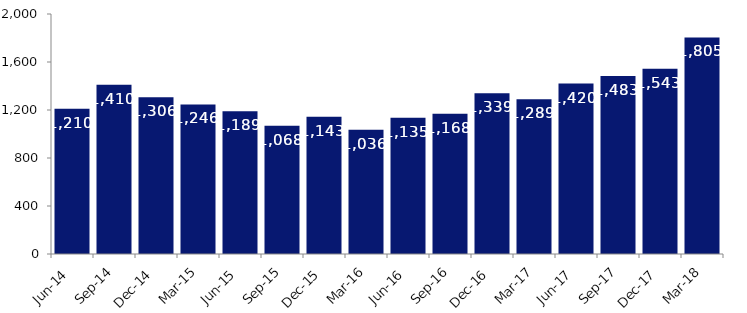
| Category | Series 0 |
|---|---|
| Jun-14 | 1210 |
| Sep-14 | 1410 |
| Dec-14 | 1306 |
| Mar-15 | 1246 |
| Jun-15 | 1189 |
| Sep-15 | 1068 |
| Dec-15 | 1143 |
| Mar-16 | 1036 |
| Jun-16 | 1135 |
| Sep-16 | 1168 |
| Dec-16 | 1339 |
| Mar-17 | 1289 |
| Jun-17 | 1420 |
| Sep-17 | 1483 |
| Dec-17 | 1543 |
| Mar-18 | 1805 |